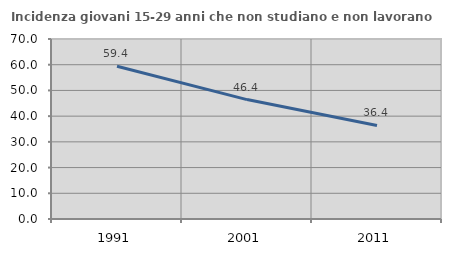
| Category | Incidenza giovani 15-29 anni che non studiano e non lavorano  |
|---|---|
| 1991.0 | 59.389 |
| 2001.0 | 46.44 |
| 2011.0 | 36.393 |